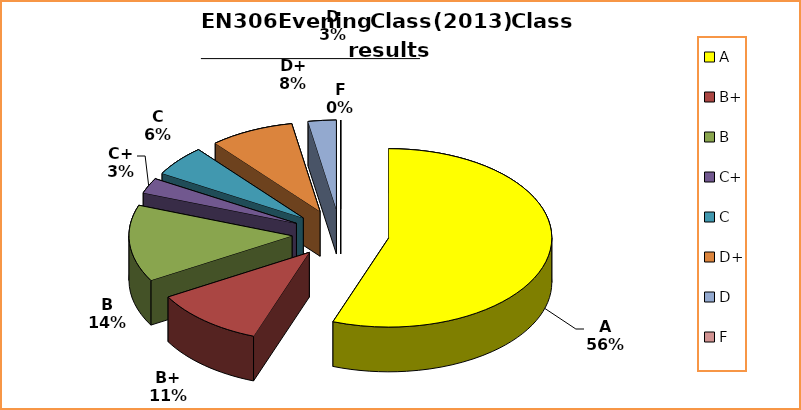
| Category | Series 0 |
|---|---|
| A | 20 |
| B+ | 4 |
| B | 5 |
| C+ | 1 |
| C | 2 |
| D+ | 3 |
| D | 1 |
| F | 0 |